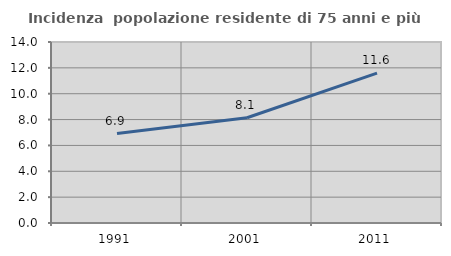
| Category | Incidenza  popolazione residente di 75 anni e più |
|---|---|
| 1991.0 | 6.92 |
| 2001.0 | 8.14 |
| 2011.0 | 11.597 |